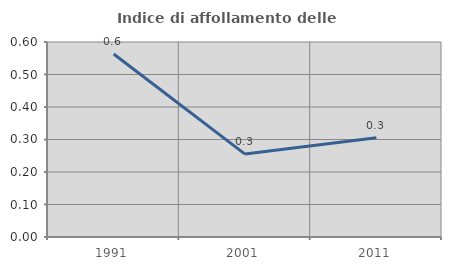
| Category | Indice di affollamento delle abitazioni  |
|---|---|
| 1991.0 | 0.563 |
| 2001.0 | 0.255 |
| 2011.0 | 0.305 |